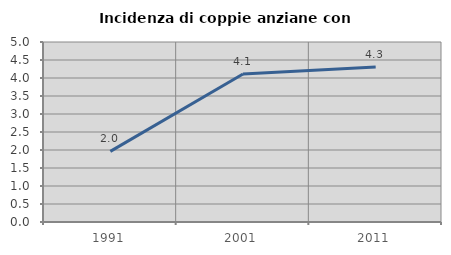
| Category | Incidenza di coppie anziane con figli |
|---|---|
| 1991.0 | 1.961 |
| 2001.0 | 4.112 |
| 2011.0 | 4.308 |